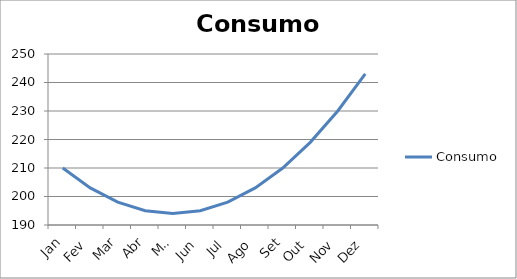
| Category | Consumo |
|---|---|
| Jan | 210 |
| Fev | 203 |
| Mar | 198 |
| Abr | 195 |
| Mai | 194 |
| Jun | 195 |
| Jul | 198 |
| Ago | 203 |
| Set | 210 |
| Out | 219 |
| Nov | 230 |
| Dez | 243 |